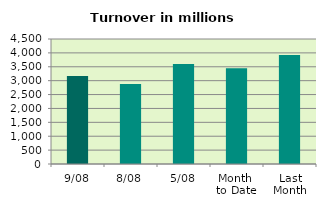
| Category | Series 0 |
|---|---|
| 9/08 | 3168.651 |
| 8/08 | 2883.529 |
| 5/08 | 3596.989 |
| Month 
to Date | 3446.563 |
| Last
Month | 3920.999 |